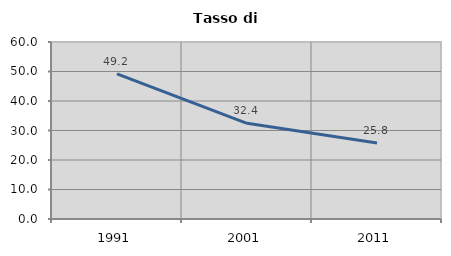
| Category | Tasso di disoccupazione   |
|---|---|
| 1991.0 | 49.226 |
| 2001.0 | 32.446 |
| 2011.0 | 25.775 |